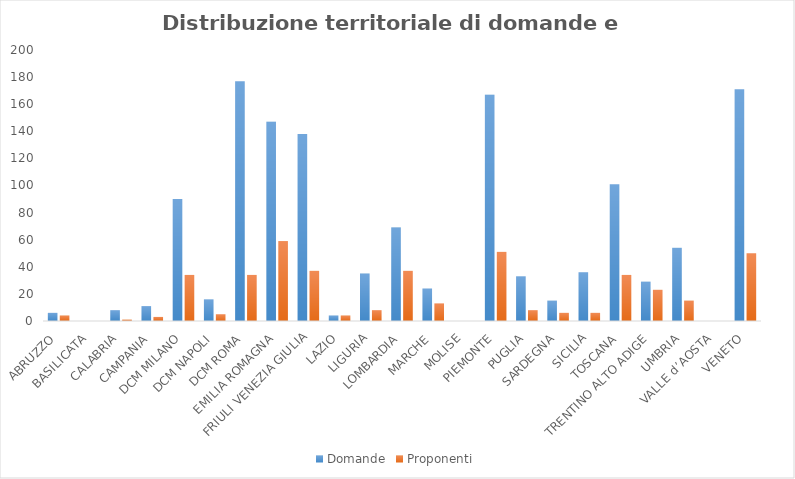
| Category | Domande | Proponenti |
|---|---|---|
| ABRUZZO | 6 | 4 |
| BASILICATA | 0 | 0 |
| CALABRIA | 8 | 1 |
| CAMPANIA | 11 | 3 |
| DCM MILANO | 90 | 34 |
| DCM NAPOLI | 16 | 5 |
| DCM ROMA | 177 | 34 |
| EMILIA ROMAGNA | 147 | 59 |
| FRIULI VENEZIA GIULIA | 138 | 37 |
| LAZIO | 4 | 4 |
| LIGURIA | 35 | 8 |
| LOMBARDIA | 69 | 37 |
| MARCHE | 24 | 13 |
| MOLISE | 0 | 0 |
| PIEMONTE | 167 | 51 |
| PUGLIA | 33 | 8 |
| SARDEGNA | 15 | 6 |
| SICILIA | 36 | 6 |
| TOSCANA | 101 | 34 |
| TRENTINO ALTO ADIGE | 29 | 23 |
| UMBRIA | 54 | 15 |
| VALLE d’AOSTA | 0 | 0 |
| VENETO | 171 | 50 |